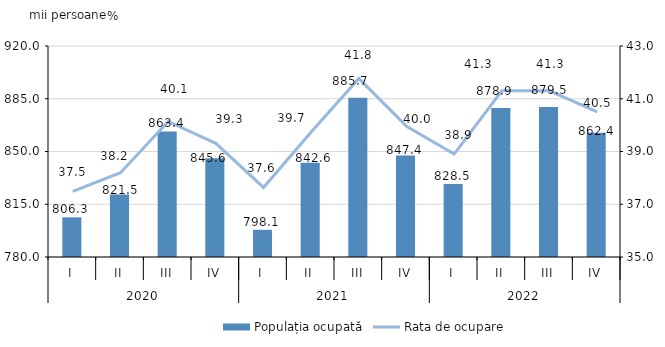
| Category | Populația ocupată |
|---|---|
| 0 | 806.327 |
| 1 | 821.515 |
| 2 | 863.351 |
| 3 | 845.568 |
| 4 | 798.054 |
| 5 | 842.611 |
| 6 | 885.715 |
| 7 | 847.401 |
| 8 | 828.5 |
| 9 | 878.9 |
| 10 | 879.5 |
| 11 | 862.4 |